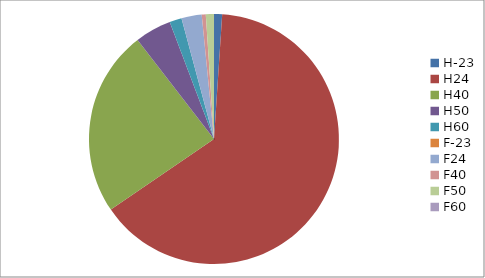
| Category | Series 0 |
|---|---|
| H-23 | 2 |
| H24 | 123 |
| H40 | 46 |
| H50 | 9 |
| H60 | 3 |
| F-23 | 0 |
| F24 | 5 |
| F40 | 1 |
| F50 | 2 |
| F60 | 0 |